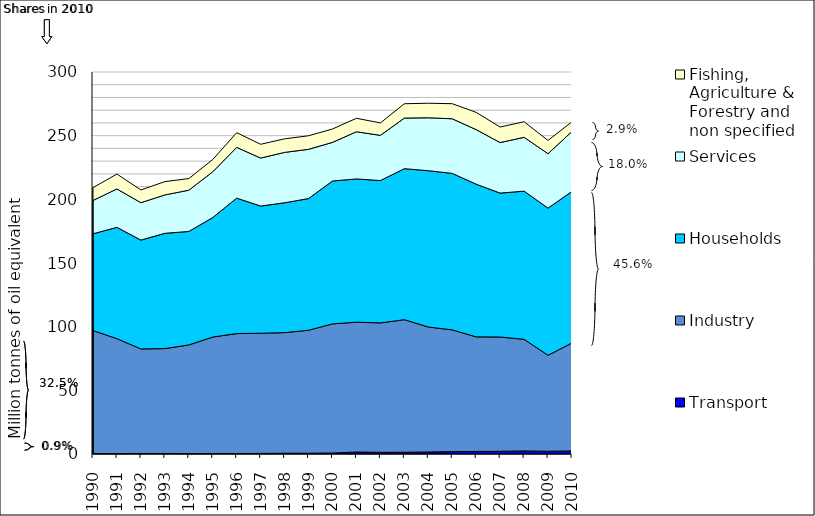
| Category | Transport | Industry | Households | Services | Fishing, Agriculture & Forestry and non specified |
|---|---|---|---|---|---|
| 1990.0 | 0.338 | 96.62 | 75.989 | 26.167 | 10.04 |
| 1991.0 | 0.339 | 90.235 | 87.44 | 30.148 | 11.707 |
| 1992.0 | 0.417 | 82.099 | 85.471 | 29.368 | 10.001 |
| 1993.0 | 0.399 | 82.375 | 90.549 | 30.137 | 10.464 |
| 1994.0 | 0.346 | 85.31 | 89.111 | 32.41 | 9.109 |
| 1995.0 | 0.374 | 91.482 | 93.828 | 35.948 | 9.653 |
| 1996.0 | 0.424 | 94.137 | 106.38 | 39.854 | 11.535 |
| 1997.0 | 0.457 | 94.389 | 99.877 | 37.699 | 10.823 |
| 1998.0 | 0.615 | 94.69 | 101.986 | 39.569 | 10.642 |
| 1999.0 | 0.638 | 96.556 | 103.418 | 38.683 | 10.634 |
| 2000.0 | 0.793 | 101.382 | 112.229 | 30.332 | 10.513 |
| 2001.0 | 1.56 | 101.949 | 112.521 | 37.068 | 10.542 |
| 2002.0 | 1.337 | 101.597 | 111.809 | 35.487 | 9.783 |
| 2003.0 | 1.372 | 104.129 | 118.6 | 39.709 | 11.265 |
| 2004.0 | 1.605 | 98.12 | 122.766 | 41.575 | 11.408 |
| 2005.0 | 1.868 | 95.621 | 122.893 | 42.891 | 11.829 |
| 2006.0 | 2.027 | 89.975 | 119.901 | 42.851 | 13.549 |
| 2007.0 | 2.132 | 89.749 | 113.034 | 39.667 | 12.208 |
| 2008.0 | 2.431 | 87.631 | 116.369 | 42.281 | 12.206 |
| 2009.0 | 2.186 | 75.342 | 115.561 | 42.747 | 10.414 |
| 2010.0 | 2.446 | 84.744 | 119.053 | 47.091 | 7.624 |